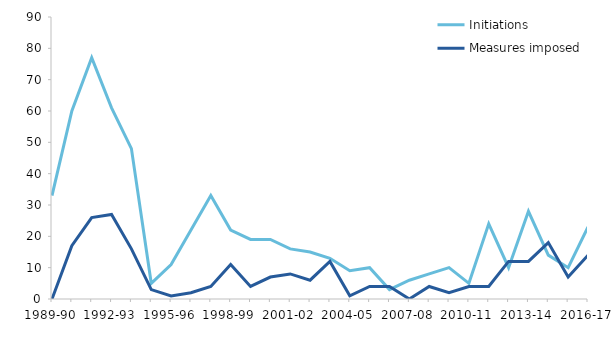
| Category | Initiations | Measures imposed |
|---|---|---|
| 1989-90 | 33 | 0 |
| 1990-91 | 60 | 17 |
| 1991-92 | 77 | 26 |
| 1992-93 | 61 | 27 |
| 1993-94 | 48 | 16 |
| 1994-95 | 5 | 3 |
| 1995-96 | 11 | 1 |
| 1996-97 | 22 | 2 |
| 1997-98 | 33 | 4 |
| 1998-99 | 22 | 11 |
| 1999-00 | 19 | 4 |
| 2000-01 | 19 | 7 |
| 2001-02 | 16 | 8 |
| 2002-03 | 15 | 6 |
| 2003-04 | 13 | 12 |
| 2004-05 | 9 | 1 |
| 2005-06 | 10 | 4 |
| 2006-07 | 3 | 4 |
| 2007-08 | 6 | 0 |
| 2008-09 | 8 | 4 |
| 2009-10 | 10 | 2 |
| 2010-11 | 5 | 4 |
| 2011-12 | 24 | 4 |
| 2012-13 | 10 | 12 |
| 2013-14 | 28 | 12 |
| 2014-15 | 14 | 18 |
| 2015-16 | 10 | 7 |
| 2016-17 | 23 | 14 |